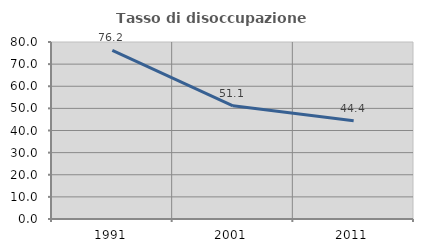
| Category | Tasso di disoccupazione giovanile  |
|---|---|
| 1991.0 | 76.19 |
| 2001.0 | 51.136 |
| 2011.0 | 44.444 |